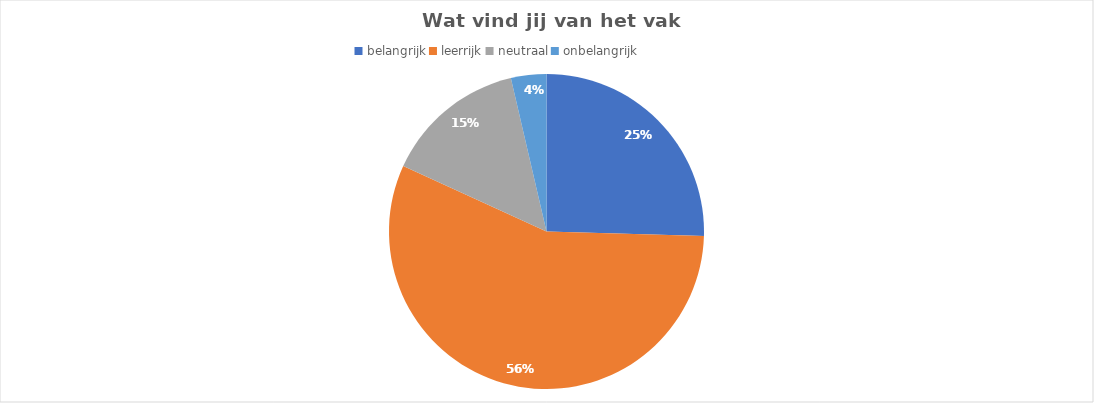
| Category | Aantal leerlingen |
|---|---|
| belangrijk | 14 |
| leerrijk | 31 |
| neutraal | 8 |
| niet leerrijk | 0 |
| onbelangrijk | 2 |